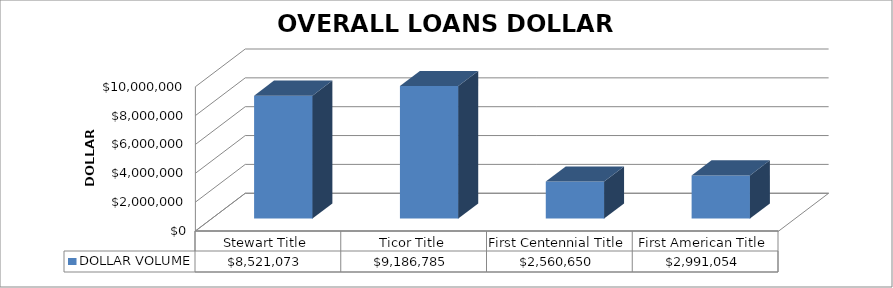
| Category | DOLLAR VOLUME |
|---|---|
| Stewart Title | 8521072.51 |
| Ticor Title | 9186785 |
| First Centennial Title | 2560650 |
| First American Title | 2991054 |